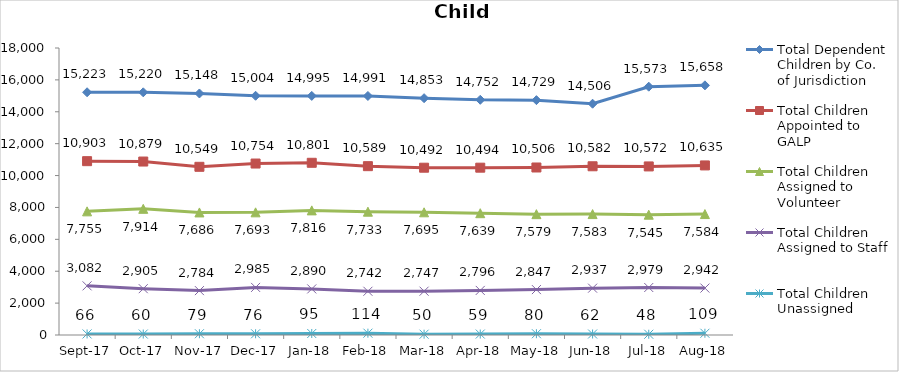
| Category | Total Dependent Children by Co. of Jurisdiction | Total Children Appointed to GALP | Total Children Assigned to Volunteer | Total Children Assigned to Staff | Total Children Unassigned |
|---|---|---|---|---|---|
| 2017-09-01 | 15223 | 10903 | 7755 | 3082 | 66 |
| 2017-10-01 | 15220 | 10879 | 7914 | 2905 | 60 |
| 2017-11-01 | 15148 | 10549 | 7686 | 2784 | 79 |
| 2017-12-01 | 15004 | 10754 | 7693 | 2985 | 76 |
| 2018-01-01 | 14995 | 10801 | 7816 | 2890 | 95 |
| 2018-02-01 | 14991 | 10589 | 7733 | 2742 | 114 |
| 2018-03-01 | 14853 | 10492 | 7695 | 2747 | 50 |
| 2018-04-01 | 14752 | 10494 | 7639 | 2796 | 59 |
| 2018-05-01 | 14729 | 10506 | 7579 | 2847 | 80 |
| 2018-06-01 | 14506 | 10582 | 7583 | 2937 | 62 |
| 2018-07-01 | 15573 | 10572 | 7545 | 2979 | 48 |
| 2018-08-01 | 15658 | 10635 | 7584 | 2942 | 109 |